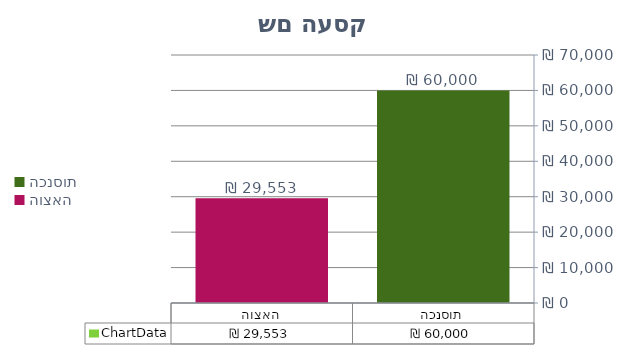
| Category | ChartData |
|---|---|
| 0 | 60000 |
| 1 | 29553 |